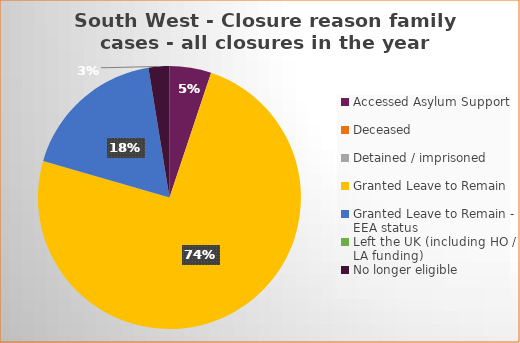
| Category | Total | Percentage |
|---|---|---|
| Accessed Asylum Support | 2 | 0.051 |
| Deceased | 0 | 0 |
| Detained / imprisoned | 0 | 0 |
| Granted Leave to Remain | 29 | 0.744 |
| Granted Leave to Remain - EEA status | 7 | 0.179 |
| Left the UK (including HO / LA funding)  | 0 | 0 |
| No longer eligible | 1 | 0.026 |